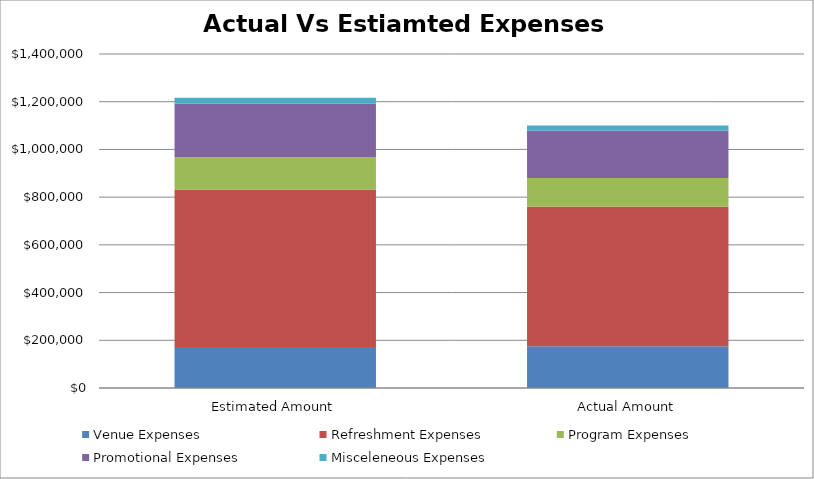
| Category | Venue Expenses | Refreshment Expenses | Program Expenses | Promotional Expenses | Misceleneous Expenses |
|---|---|---|---|---|---|
| Estimated Amount | 172000 | 660000 | 135000 | 225000 | 25000 |
| Actual Amount | 175000 | 585000 | 120500 | 197750 | 22200 |